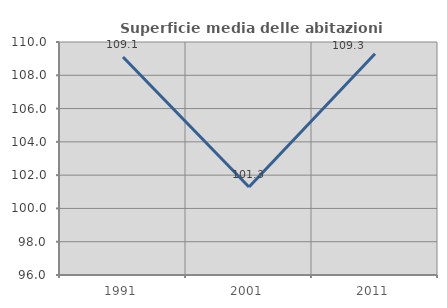
| Category | Superficie media delle abitazioni occupate |
|---|---|
| 1991.0 | 109.096 |
| 2001.0 | 101.285 |
| 2011.0 | 109.298 |